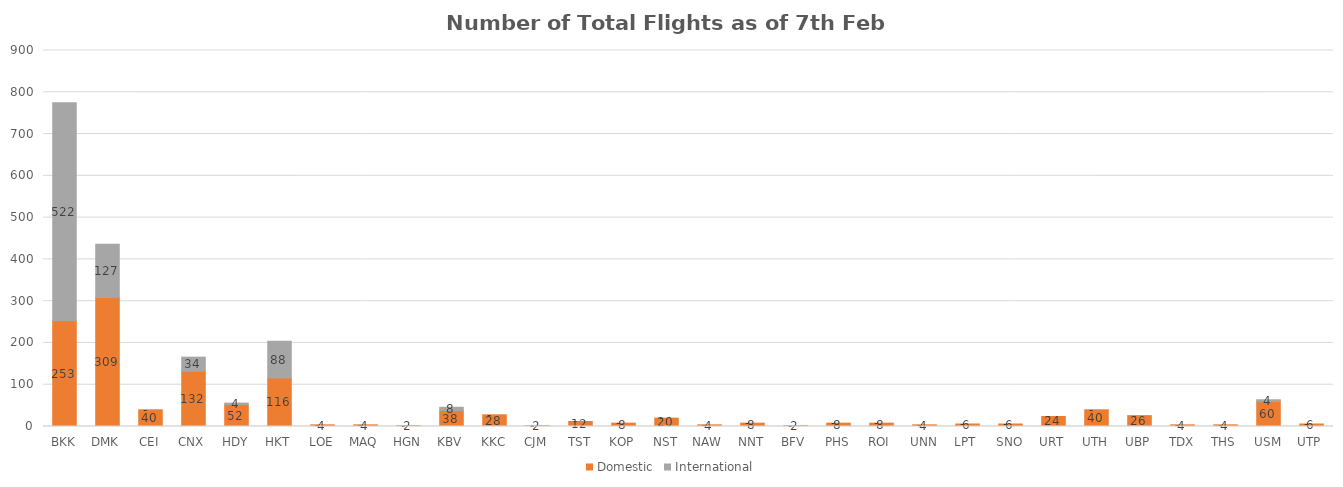
| Category | Domestic | International |
|---|---|---|
| BKK | 253 | 522 |
| DMK | 309 | 127 |
| CEI | 40 | 0 |
| CNX | 132 | 34 |
| HDY | 52 | 4 |
| HKT | 116 | 88 |
| LOE | 4 | 0 |
| MAQ | 4 | 0 |
| HGN | 2 | 0 |
| KBV | 38 | 8 |
| KKC | 28 | 0 |
| CJM | 2 | 0 |
| TST | 12 | 0 |
| KOP | 8 | 0 |
| NST | 20 | 0 |
| NAW | 4 | 0 |
| NNT | 8 | 0 |
| BFV | 2 | 0 |
| PHS | 8 | 0 |
| ROI | 8 | 0 |
| UNN | 4 | 0 |
| LPT | 6 | 0 |
| SNO | 6 | 0 |
| URT | 24 | 0 |
| UTH | 40 | 0 |
| UBP | 26 | 0 |
| TDX | 4 | 0 |
| THS | 4 | 0 |
| USM | 60 | 4 |
| UTP | 6 | 0 |